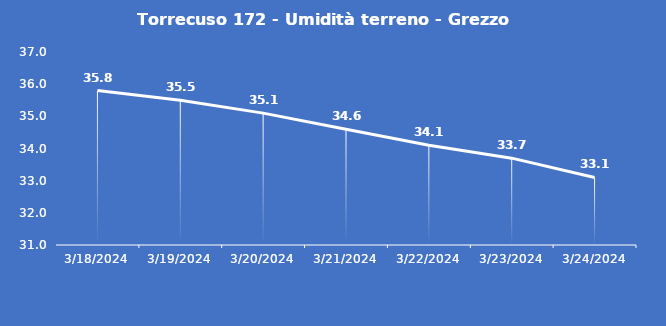
| Category | Torrecuso 172 - Umidità terreno - Grezzo (%VWC) |
|---|---|
| 3/18/24 | 35.8 |
| 3/19/24 | 35.5 |
| 3/20/24 | 35.1 |
| 3/21/24 | 34.6 |
| 3/22/24 | 34.1 |
| 3/23/24 | 33.7 |
| 3/24/24 | 33.1 |